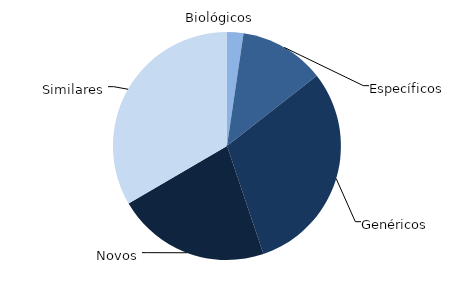
| Category | Series 0 |
|---|---|
| Biológicos | 91764986.182 |
| Específicos | 478515844.6 |
| Genéricos | 1200985279.935 |
| Novos | 859822623.714 |
| Similares | 1320640732.152 |